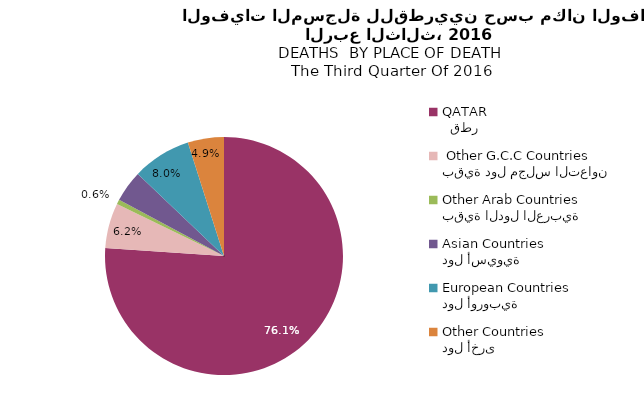
| Category | Series 1 |
|---|---|
|   قطر
QATAR | 124 |
| بقية دول مجلس التعاون
 Other G.C.C Countries | 10 |
| بقية الدول العربية
Other Arab Countries | 1 |
| دول أسيوية
Asian Countries | 7 |
| دول أوروبية
European Countries | 13 |
| دول أخرى
Other Countries | 8 |